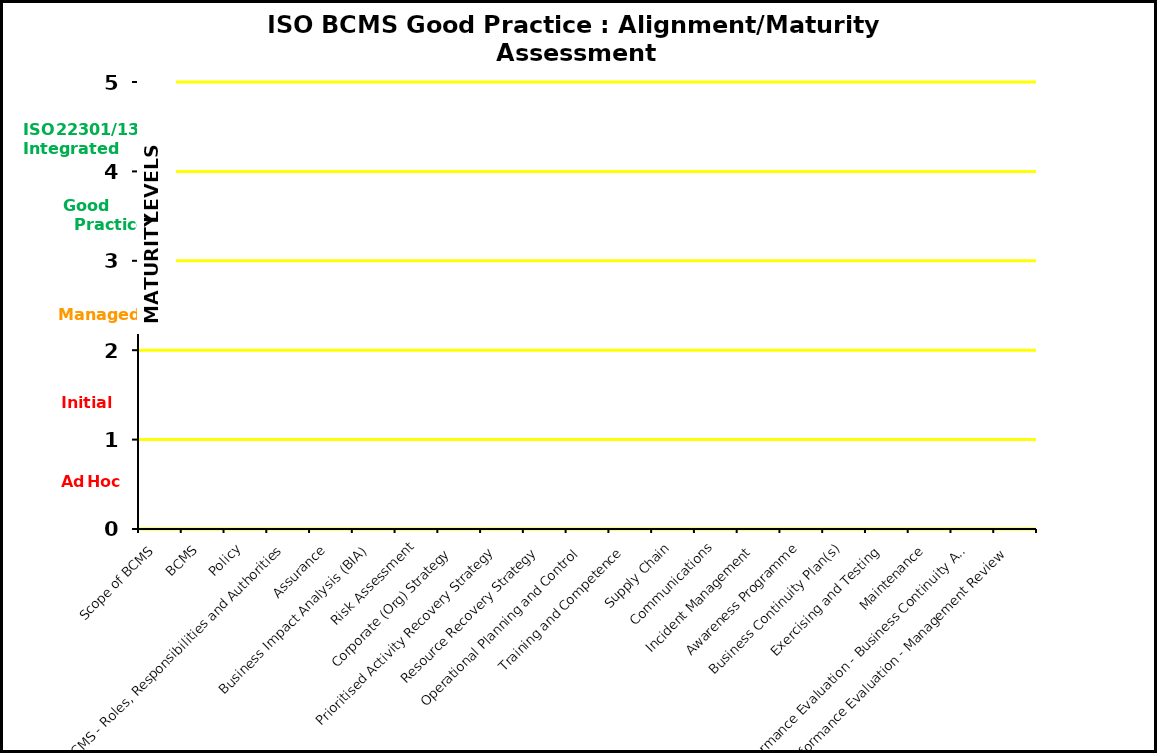
| Category | Series 0 |
|---|---|
| Scope of BCMS | 0 |
| BCMS | 0 |
| Policy | 0 |
| BCMS - Roles, Responsibilities and Authorities | 0 |
| Assurance | 0 |
| Business Impact Analysis (BIA) | 0 |
| Risk Assessment | 0 |
| Corporate (Org) Strategy | 0 |
| Prioritised Activity Recovery Strategy | 0 |
| Resource Recovery Strategy | 0 |
| Operational Planning and Control | 0 |
| Training and Competence | 0 |
| Supply Chain | 0 |
| Communications | 0 |
| Incident Management | 0 |
| Awareness Programme | 0 |
| Business Continuity Plan(s) | 0 |
| Exercising and Testing | 0 |
| Maintenance | 0 |
| Performance Evaluation - Business Continuity Arrangements | 0 |
| Performance Evaluation - Management Review | 0 |